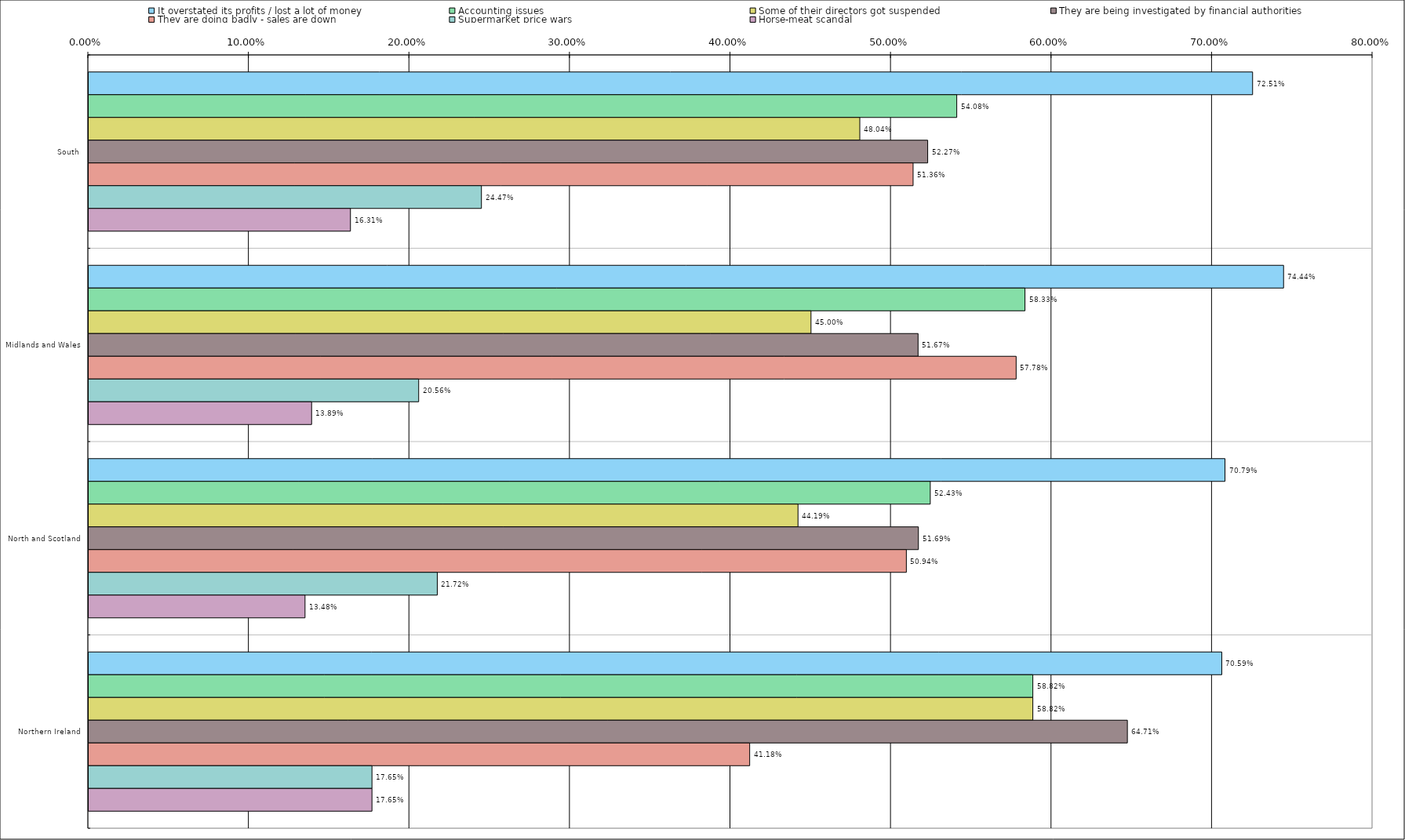
| Category | It overstated its profits / lost a lot of money | Accounting issues | Some of their directors got suspended | They are being investigated by financial authorities | They are doing badly - sales are down | Supermarket price wars | Horse-meat scandal |
|---|---|---|---|---|---|---|---|
| 0 | 0.725 | 0.541 | 0.48 | 0.523 | 0.514 | 0.245 | 0.163 |
| 1 | 0.744 | 0.583 | 0.45 | 0.517 | 0.578 | 0.206 | 0.139 |
| 2 | 0.708 | 0.524 | 0.442 | 0.517 | 0.509 | 0.217 | 0.135 |
| 3 | 0.706 | 0.588 | 0.588 | 0.647 | 0.412 | 0.176 | 0.176 |